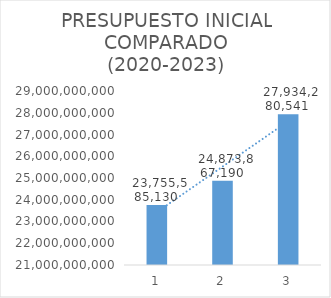
| Category | Series 0 |
|---|---|
| 0 | 23755585130 |
| 1 | 24873867190 |
| 2 | 27934280541 |